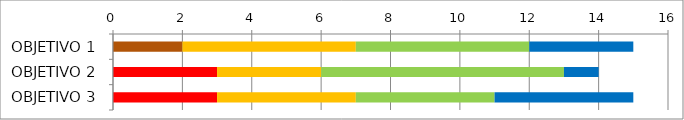
| Category | Series 0 | Series 1 | Series 2 | Series 3 | Series 4 | Series 5 |
|---|---|---|---|---|---|---|
| OBJETIVO 1 | 2 | 0 | 0 | 5 | 5 | 3 |
| OBJETIVO 2 | 0 | 0 | 3 | 3 | 7 | 1 |
| OBJETIVO 3 | 0 | 0 | 3 | 4 | 4 | 4 |